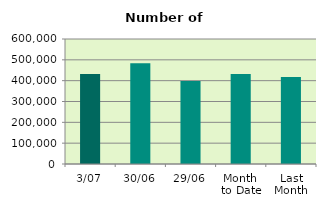
| Category | Series 0 |
|---|---|
| 3/07 | 432254 |
| 30/06 | 484150 |
| 29/06 | 398010 |
| Month 
to Date | 432254 |
| Last
Month | 418146.182 |